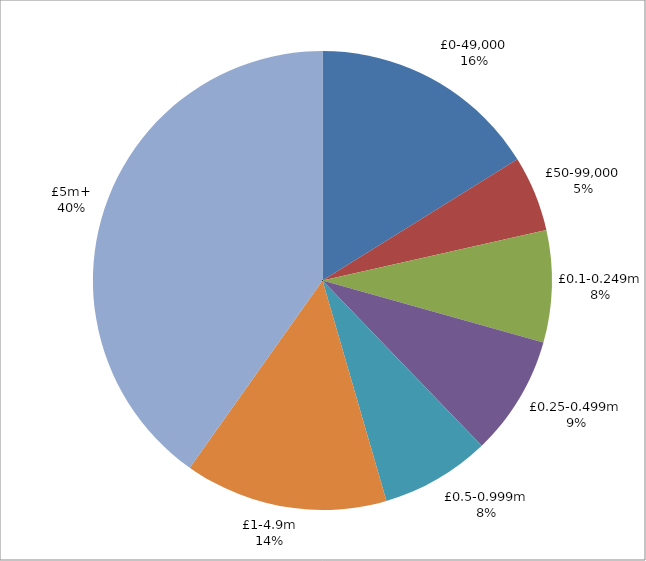
| Category | Series 0 |
|---|---|
| £0-49,000 | 88 |
| £50-99,000 | 29 |
| £0.1-0.249m | 43 |
| £0.25-0.499m | 46 |
| £0.5-0.999m | 42 |
| £1-4.9m | 78 |
| £5m+ | 219 |